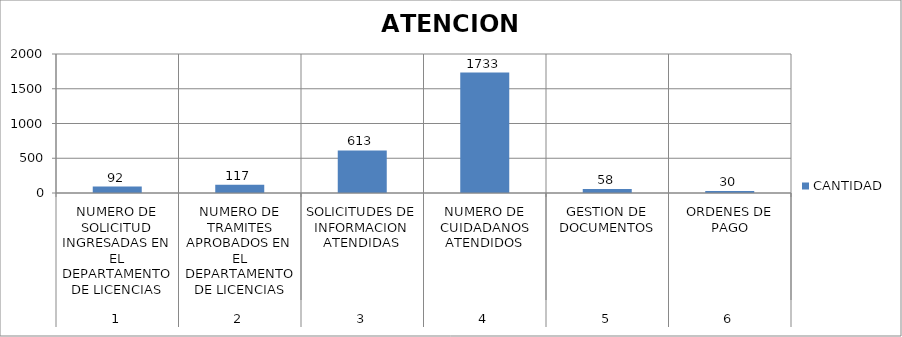
| Category | CANTIDAD |
|---|---|
| 0 | 92 |
| 1 | 117 |
| 2 | 613 |
| 3 | 1733 |
| 4 | 58 |
| 5 | 30 |